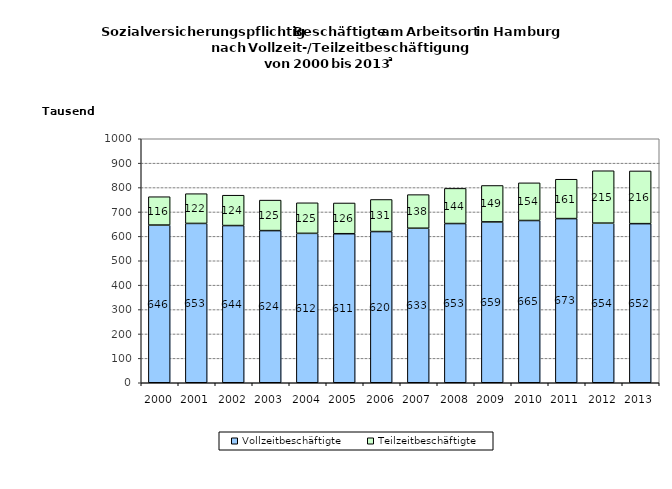
| Category | Vollzeitbeschäftigte | Teilzeitbeschäftigte |
|---|---|---|
| 2000.0 | 646215 | 116256 |
| 2001.0 | 652961 | 121908 |
| 2002.0 | 644260 | 124427 |
| 2003.0 | 623539 | 125008 |
| 2004.0 | 612277 | 125285 |
| 2005.0 | 610795 | 125982 |
| 2006.0 | 619667 | 131459 |
| 2007.0 | 633311 | 137751 |
| 2008.0 | 652533 | 144061 |
| 2009.0 | 659237 | 149283 |
| 2010.0 | 664956 | 154370 |
| 2011.0 | 672796 | 161285 |
| 2012.0 | 654159 | 214736 |
| 2013.0 | 652034 | 216068 |